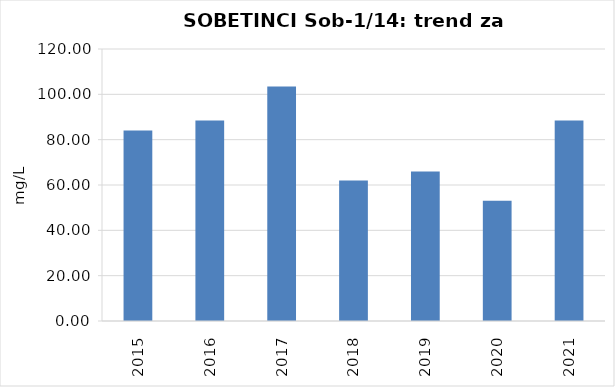
| Category | Vsota |
|---|---|
| 2015 | 84 |
| 2016 | 88.5 |
| 2017 | 103.5 |
| 2018 | 62 |
| 2019 | 66 |
| 2020 | 53 |
| 2021 | 88.5 |